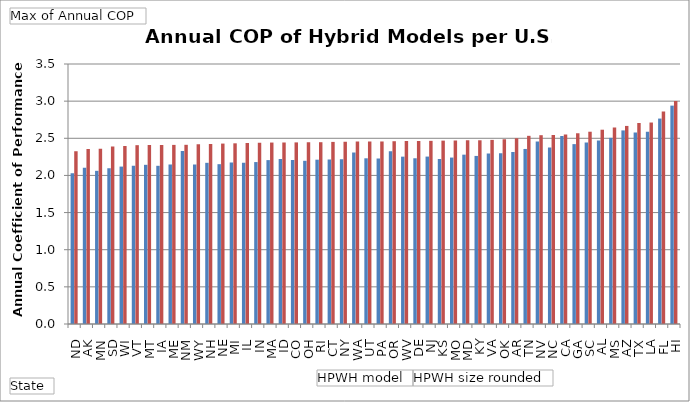
| Category | Hybrid heat pump - 50 | Hybrid heat pump - 80 |
|---|---|---|
| ND | 2.029 | 2.326 |
| AK | 2.104 | 2.356 |
| MN | 2.062 | 2.359 |
| SD | 2.097 | 2.388 |
| WI | 2.119 | 2.396 |
| VT | 2.131 | 2.407 |
| MT | 2.143 | 2.41 |
| IA | 2.13 | 2.41 |
| ME | 2.147 | 2.411 |
| NM | 2.328 | 2.412 |
| WY | 2.147 | 2.421 |
| NH | 2.17 | 2.425 |
| NE | 2.151 | 2.429 |
| MI | 2.173 | 2.432 |
| IL | 2.17 | 2.436 |
| IN | 2.18 | 2.44 |
| MA | 2.206 | 2.443 |
| ID | 2.22 | 2.443 |
| CO | 2.208 | 2.445 |
| OH | 2.197 | 2.446 |
| RI | 2.212 | 2.447 |
| CT | 2.214 | 2.451 |
| NY | 2.219 | 2.453 |
| WA | 2.309 | 2.455 |
| UT | 2.231 | 2.457 |
| PA | 2.228 | 2.457 |
| OR | 2.325 | 2.46 |
| WV | 2.253 | 2.463 |
| DE | 2.231 | 2.464 |
| NJ | 2.254 | 2.465 |
| KS | 2.221 | 2.468 |
| MO | 2.241 | 2.472 |
| MD | 2.28 | 2.473 |
| KY | 2.263 | 2.473 |
| VA | 2.297 | 2.478 |
| OK | 2.3 | 2.486 |
| AR | 2.315 | 2.5 |
| TN | 2.357 | 2.533 |
| NV | 2.456 | 2.542 |
| NC | 2.376 | 2.543 |
| CA | 2.531 | 2.551 |
| GA | 2.421 | 2.568 |
| SC | 2.443 | 2.588 |
| AL | 2.47 | 2.615 |
| MS | 2.506 | 2.646 |
| AZ | 2.606 | 2.666 |
| TX | 2.578 | 2.706 |
| LA | 2.586 | 2.712 |
| FL | 2.765 | 2.862 |
| HI | 2.94 | 3.003 |